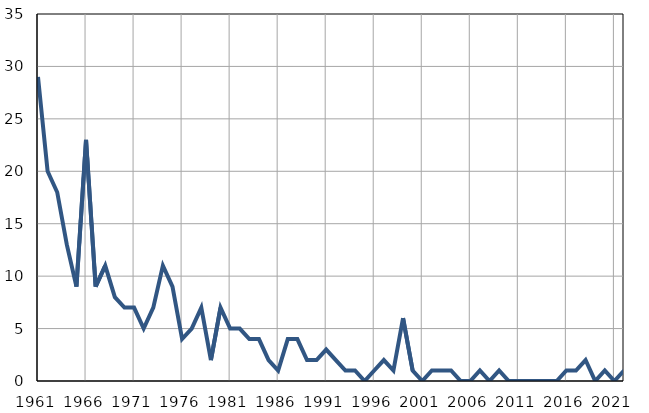
| Category | Infants
deaths |
|---|---|
| 1961.0 | 29 |
| 1962.0 | 20 |
| 1963.0 | 18 |
| 1964.0 | 13 |
| 1965.0 | 9 |
| 1966.0 | 23 |
| 1967.0 | 9 |
| 1968.0 | 11 |
| 1969.0 | 8 |
| 1970.0 | 7 |
| 1971.0 | 7 |
| 1972.0 | 5 |
| 1973.0 | 7 |
| 1974.0 | 11 |
| 1975.0 | 9 |
| 1976.0 | 4 |
| 1977.0 | 5 |
| 1978.0 | 7 |
| 1979.0 | 2 |
| 1980.0 | 7 |
| 1981.0 | 5 |
| 1982.0 | 5 |
| 1983.0 | 4 |
| 1984.0 | 4 |
| 1985.0 | 2 |
| 1986.0 | 1 |
| 1987.0 | 4 |
| 1988.0 | 4 |
| 1989.0 | 2 |
| 1990.0 | 2 |
| 1991.0 | 3 |
| 1992.0 | 2 |
| 1993.0 | 1 |
| 1994.0 | 1 |
| 1995.0 | 0 |
| 1996.0 | 1 |
| 1997.0 | 2 |
| 1998.0 | 1 |
| 1999.0 | 6 |
| 2000.0 | 1 |
| 2001.0 | 0 |
| 2002.0 | 1 |
| 2003.0 | 1 |
| 2004.0 | 1 |
| 2005.0 | 0 |
| 2006.0 | 0 |
| 2007.0 | 1 |
| 2008.0 | 0 |
| 2009.0 | 1 |
| 2010.0 | 0 |
| 2011.0 | 0 |
| 2012.0 | 0 |
| 2013.0 | 0 |
| 2014.0 | 0 |
| 2015.0 | 0 |
| 2016.0 | 1 |
| 2017.0 | 1 |
| 2018.0 | 2 |
| 2019.0 | 0 |
| 2020.0 | 1 |
| 2021.0 | 0 |
| 2022.0 | 1 |